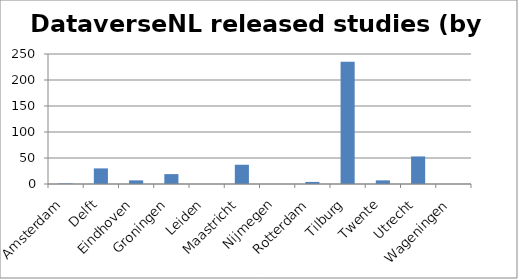
| Category | DataverseNL released studies (by hand) |
|---|---|
| Amsterdam | 1 |
| Delft | 30 |
| Eindhoven | 7 |
| Groningen | 19 |
| Leiden | 0 |
| Maastricht | 37 |
| Nijmegen | 0 |
| Rotterdam | 4 |
| Tilburg | 235 |
| Twente | 7 |
| Utrecht | 53 |
| Wageningen | 0 |